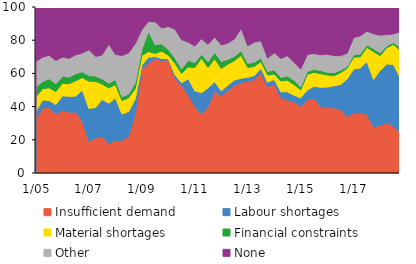
| Category | Insufficient demand | Labour shortages | Material shortages | Financial constraints | Other | None |
|---|---|---|---|---|---|---|
|  1/05 | 32.4 | 4.7 | 8.8 | 6 | 15.3 | 32.8 |
| 4 | 39.2 | 4.8 | 6.7 | 4.4 | 14.7 | 30.2 |
| 7 | 39.6 | 4.1 | 7.6 | 5.5 | 14.1 | 29.1 |
| 10 | 35.5 | 5.7 | 7.9 | 4.6 | 14.1 | 32.2 |
|  1/06 | 37.8 | 8.7 | 7.5 | 4.3 | 11.5 | 30.2 |
| 4 | 36.6 | 9.6 | 7.6 | 4 | 11.3 | 30.9 |
| 7 | 36.8 | 9.5 | 9.3 | 4.2 | 11.4 | 28.8 |
| 10 | 31.4 | 18.6 | 7.5 | 3.5 | 11.3 | 27.7 |
|  1/07 | 19.1 | 19.7 | 16.5 | 3.4 | 15.6 | 25.7 |
| 4 | 21 | 18.5 | 15.7 | 3.2 | 11.8 | 29.8 |
| 7 | 22.2 | 22.1 | 9.3 | 3.1 | 14.5 | 28.8 |
| 10 | 17.7 | 24.3 | 9.2 | 2.9 | 23.5 | 22.4 |
|  1/08 | 19.8 | 25.4 | 8.1 | 3 | 15.2 | 28.5 |
| 4 | 19.7 | 15.8 | 8.1 | 2.3 | 24.9 | 29.2 |
| 7 | 22.2 | 14.9 | 8.2 | 2.3 | 24.7 | 27.7 |
| 10 | 35.9 | 8.7 | 6.3 | 3.3 | 23.7 | 22.1 |
|  1/09 | 62.8 | 2.3 | 5.7 | 3.8 | 11.8 | 13.6 |
| 4 | 65.9 | 3.8 | 3.5 | 12.1 | 6 | 8.7 |
| 7 | 69.3 | 0.9 | 1.8 | 5.3 | 13.8 | 8.9 |
| 10 | 67.5 | 1.5 | 4.4 | 4.4 | 9.6 | 12.6 |
|  1/10 | 68.4 | 0.5 | 2.1 | 3.4 | 13.8 | 11.8 |
| 4 | 57.1 | 2 | 7 | 3.2 | 17.3 | 13.4 |
| 7 | 52.8 | 1.6 | 5.6 | 2.7 | 17.7 | 19.6 |
| 10 | 47.2 | 9.6 | 7.1 | 3.9 | 11 | 21.2 |
|  1/11 | 40.3 | 9.3 | 14 | 2.9 | 10 | 23.5 |
| 4 | 35.7 | 12.7 | 20.8 | 2.2 | 9.5 | 19.1 |
| 7 | 40 | 11.3 | 12.3 | 3.4 | 10.5 | 22.5 |
| 10 | 49.5 | 5.5 | 13.8 | 3.8 | 9.3 | 18.1 |
|  1/12 | 46.2 | 3.3 | 13.4 | 4.3 | 9.9 | 22.9 |
| 4 | 49.6 | 3.4 | 12.6 | 2.9 | 9.8 | 21.7 |
| 7 | 52.8 | 3.2 | 11.7 | 2.6 | 10.5 | 19.2 |
| 10 | 54.4 | 2.7 | 13.8 | 2.8 | 13.5 | 12.8 |
|  1/13 | 55.4 | 2.3 | 5.8 | 2.5 | 10.6 | 23.4 |
| 4 | 56.2 | 2.5 | 5.6 | 2.6 | 11.9 | 21.2 |
| 7 | 60.3 | 2.8 | 4 | 2.2 | 10.4 | 20.3 |
| 10 | 52 | 2.7 | 4.3 | 2.1 | 8.1 | 30.8 |
|  1/14 | 53.6 | 2.8 | 3.3 | 2.5 | 10.3 | 27.5 |
| 4 | 45.4 | 3.5 | 6.5 | 2.2 | 11.4 | 31 |
| 7 | 43.9 | 5 | 7 | 2.5 | 12.3 | 29.3 |
| 10 | 42.8 | 4 | 6.5 | 2.5 | 10.8 | 33.4 |
|  1/15 | 40.3 | 5 | 4.8 | 1.7 | 10.8 | 37.4 |
| 4 | 44.2 | 5.8 | 9.4 | 1.8 | 10.2 | 28.6 |
| 7 | 45 | 7.3 | 8.4 | 1.7 | 9.6 | 28 |
| 10 | 40 | 11.6 | 8.2 | 2 | 9.4 | 28.8 |
|  1/16 | 39.6 | 12.2 | 7.3 | 1.6 | 10.8 | 28.5 |
| 4 | 39.2 | 13.3 | 6.1 | 1.8 | 10.4 | 29.2 |
| 7 | 38.2 | 15.1 | 7.1 | 1.5 | 8.7 | 29.4 |
| 10 | 34 | 22.6 | 6.4 | 1.1 | 8.1 | 27.8 |
|  1/17 | 36.1 | 26.6 | 7.1 | 1.3 | 10.5 | 18.4 |
| 4 | 36.3 | 27 | 6.7 | 1.7 | 10.9 | 17.4 |
| 7 | 35.4 | 31.8 | 8.5 | 1.5 | 8.3 | 14.5 |
| 10 | 27.8 | 28.5 | 16.8 | 1.8 | 9 | 16.1 |
|  1/18 | 28.7 | 33 | 9 | 1.7 | 10.6 | 17 |
| 4 | 30.3 | 35.4 | 9.8 | 1.1 | 6.8 | 16.3 |
| 7 | 28.1 | 37.3 | 12 | 1.2 | 5.1 | 16.3 |
| 10 | 24.8 | 32.7 | 16.6 | 1.6 | 9.5 | 14.8 |